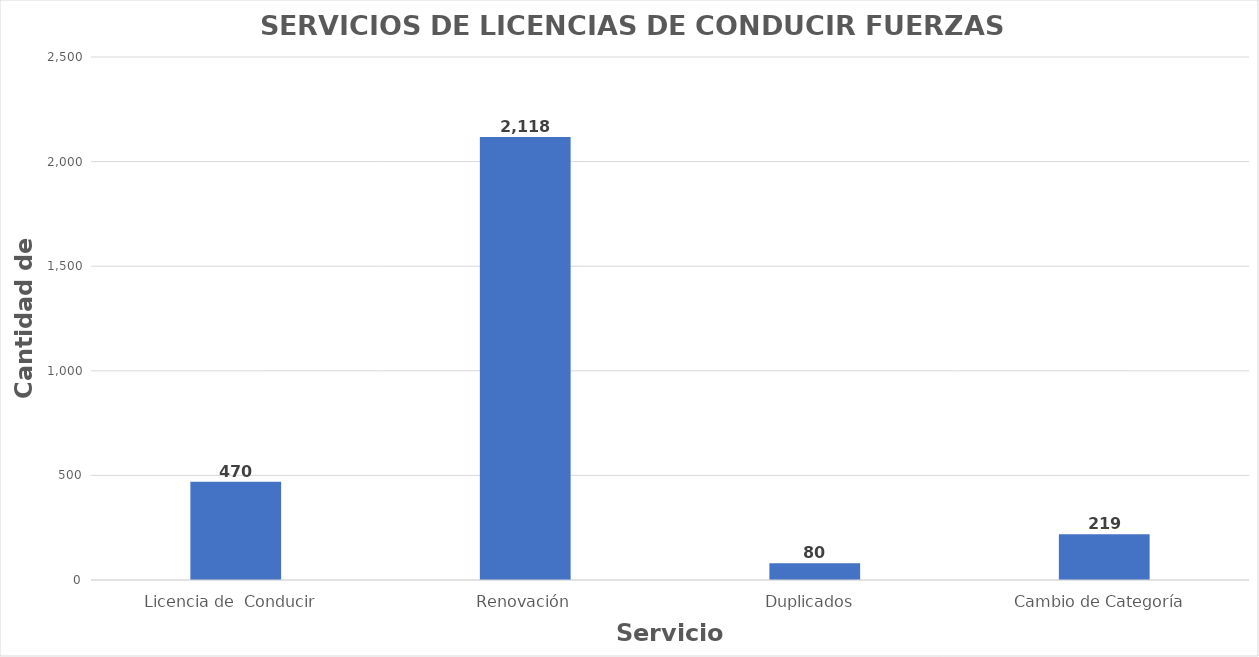
| Category | Series 0 |
|---|---|
| Licencia de  Conducir  | 470 |
| Renovación | 2118 |
| Duplicados  | 80 |
| Cambio de Categoría  | 219 |